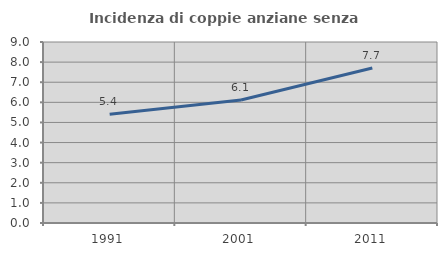
| Category | Incidenza di coppie anziane senza figli  |
|---|---|
| 1991.0 | 5.405 |
| 2001.0 | 6.117 |
| 2011.0 | 7.707 |